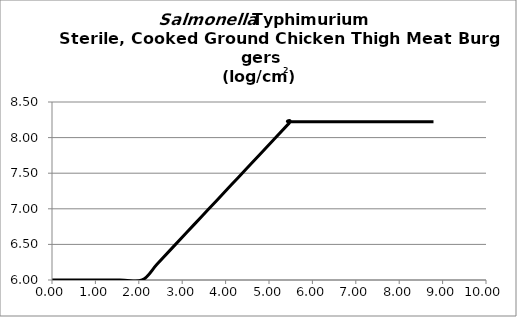
| Category | log/cm2 |
|---|---|
| 0.0 | 6 |
| 0.5193211820347383 | 6 |
| 1.557963546104215 | 6 |
| 2.0772847281389533 | 6 |
| 2.418931172597373 | 6.222 |
| 2.7605776170557923 | 6.444 |
| 3.102224061514212 | 6.667 |
| 3.4438705059726313 | 6.889 |
| 3.785516950431051 | 7.111 |
| 4.12716339488947 | 7.333 |
| 4.46880983934789 | 7.555 |
| 4.81045628380631 | 7.777 |
| 5.459584528277307 | 8.2 |
| 5.493749172723149 | 8.222 |
| 6.5924990072677785 | 8.222 |
| 7.691248841812408 | 8.222 |
| 8.789998676357039 | 8.222 |